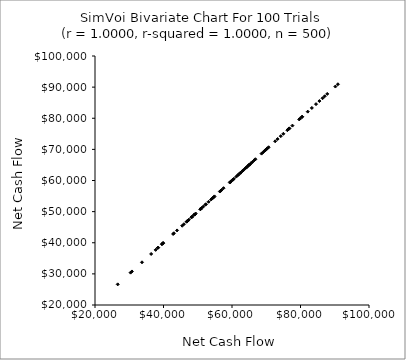
| Category | Series 0 |
|---|---|
| 48154.977217583066 | 48154.977 |
| 70682.51596479409 | 70682.516 |
| 86436.5420225312 | 86436.542 |
| 66834.48184401443 | 66834.482 |
| 77634.78412678391 | 77634.784 |
| 61919.69156738762 | 61919.692 |
| 70156.48960359007 | 70156.49 |
| 90184.72702924711 | 90184.727 |
| 47412.03063120171 | 47412.031 |
| 47153.82297423416 | 47153.823 |
| 70315.16078395753 | 70315.161 |
| 54893.18877706429 | 54893.189 |
| 59352.21812398874 | 59352.218 |
| 43958.34105482556 | 43958.341 |
| 57531.76421218569 | 57531.764 |
| 33721.52515674997 | 33721.525 |
| 39877.59826338139 | 39877.598 |
| 56752.994389964195 | 56752.994 |
| 72608.13298813373 | 72608.133 |
| 38446.16943664757 | 38446.169 |
| 60314.1827053593 | 60314.183 |
| 69834.56499417181 | 69834.565 |
| 64337.29943733051 | 64337.299 |
| 47130.56907554706 | 47130.569 |
| 38325.85133645695 | 38325.851 |
| 54219.642747983875 | 54219.643 |
| 48262.903444120406 | 48262.903 |
| 63352.32465664006 | 63352.325 |
| 60252.79794104138 | 60252.798 |
| 76166.65208670945 | 76166.652 |
| 76750.59733998531 | 76750.597 |
| 69012.14545992219 | 69012.145 |
| 79919.6168878054 | 79919.617 |
| 62504.38922290401 | 62504.389 |
| 65119.80775418579 | 65119.808 |
| 61264.20784551128 | 61264.208 |
| 30782.138242632733 | 30782.138 |
| 51160.15559836281 | 51160.156 |
| 43050.6036892064 | 43050.604 |
| 39518.391990074204 | 39518.392 |
| 54506.8366129497 | 54506.837 |
| 49043.35357984937 | 49043.354 |
| 90921.8678704726 | 90921.868 |
| 74244.3059296348 | 74244.306 |
| 37711.497301807656 | 37711.497 |
| 53905.23708398311 | 53905.237 |
| 82120.99361417707 | 82120.994 |
| 65974.25845446187 | 65974.258 |
| 52260.23134478972 | 52260.231 |
| 26633.522325595914 | 26633.522 |
| 66494.18093266759 | 66494.181 |
| 83312.58172655286 | 83312.582 |
| 59711.91548784729 | 59711.915 |
| 50778.427713971025 | 50778.428 |
| 52375.896013475955 | 52375.896 |
| 59511.3111831608 | 59511.311 |
| 30399.98168625337 | 30399.982 |
| 50832.5745551164 | 50832.575 |
| 56965.682830189384 | 56965.683 |
| 75000.89940822551 | 75000.899 |
| 36397.463767583315 | 36397.464 |
| 64164.308127635755 | 64164.308 |
| 53162.49106132139 | 53162.491 |
| 76683.56462035289 | 76683.565 |
| 80473.88928697901 | 80473.889 |
| 84532.35526339684 | 84532.355 |
| 46867.55294035408 | 46867.553 |
| 39668.01394907492 | 39668.014 |
| 69491.07617752672 | 69491.076 |
| 48421.042627684474 | 48421.043 |
| 59624.23058747544 | 59624.231 |
| 45949.3432467028 | 45949.343 |
| 42811.343717013704 | 42811.344 |
| 85524.03185049415 | 85524.032 |
| 56458.65201604321 | 56458.652 |
| 61718.99473382138 | 61718.995 |
| 45467.77841728845 | 45467.778 |
| 64909.654327798096 | 64909.654 |
| 49068.58371308889 | 49068.584 |
| 63024.92257023466 | 63024.923 |
| 76433.51148161334 | 76433.511 |
| 51620.01489270308 | 51620.015 |
| 39893.69821022398 | 39893.698 |
| 62462.52936968756 | 62462.529 |
| 79619.57845908559 | 79619.578 |
| 87814.65117612609 | 87814.651 |
| 54668.48657157927 | 54668.487 |
| 65126.774458932865 | 65126.774 |
| 63850.06819411562 | 63850.068 |
| 46750.59939898617 | 46750.599 |
| 87060.51842574339 | 87060.518 |
| 80461.87214440771 | 80461.872 |
| 50763.753905041885 | 50763.754 |
| 49094.7505282223 | 49094.751 |
| 68637.50571250387 | 68637.506 |
| 64732.77941082179 | 64732.779 |
| 73323.76729660372 | 73323.767 |
| 49394.48321932916 | 49394.483 |
| 60547.0956469481 | 60547.096 |
| 65516.21868994972 | 65516.219 |